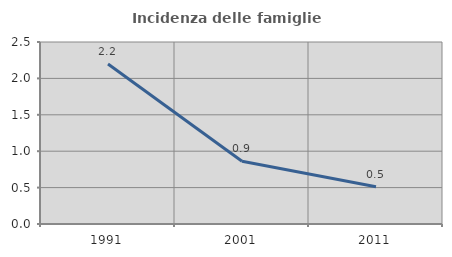
| Category | Incidenza delle famiglie numerose |
|---|---|
| 1991.0 | 2.197 |
| 2001.0 | 0.861 |
| 2011.0 | 0.511 |